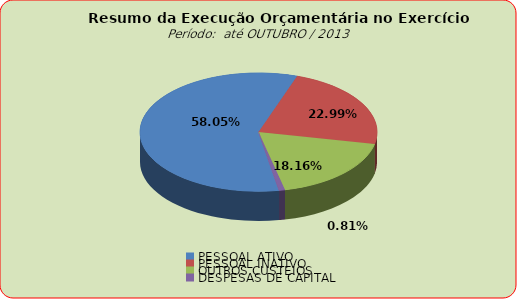
| Category | Series 0 |
|---|---|
| PESSOAL ATIVO | 78234063.47 |
| PESSOAL INATIVO | 30980309.73 |
| OUTROS CUSTEIOS | 24474682.66 |
| DESPESAS DE CAPITAL | 1088341.68 |